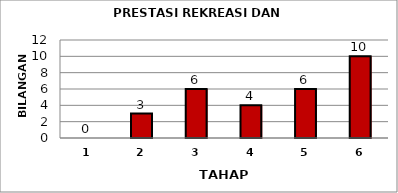
| Category | Series 0 |
|---|---|
| 1.0 | 0 |
| 2.0 | 3 |
| 3.0 | 6 |
| 4.0 | 4 |
| 5.0 | 6 |
| 6.0 | 10 |